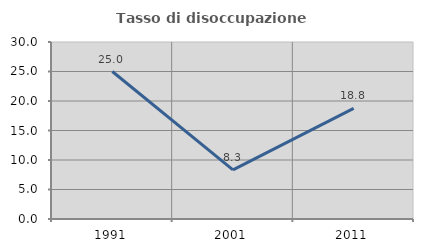
| Category | Tasso di disoccupazione giovanile  |
|---|---|
| 1991.0 | 25 |
| 2001.0 | 8.333 |
| 2011.0 | 18.75 |